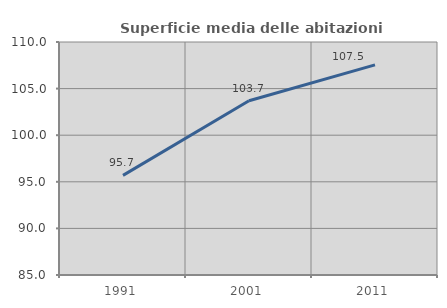
| Category | Superficie media delle abitazioni occupate |
|---|---|
| 1991.0 | 95.687 |
| 2001.0 | 103.697 |
| 2011.0 | 107.549 |